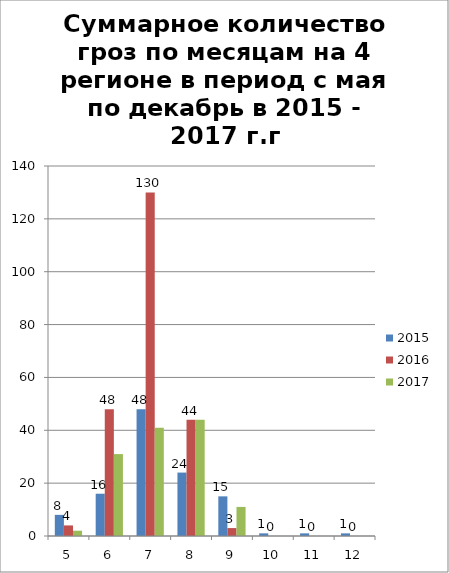
| Category | 2015 | 2016 | 2017 |
|---|---|---|---|
| 5.0 | 8 | 4 | 2 |
| 6.0 | 16 | 48 | 31 |
| 7.0 | 48 | 130 | 41 |
| 8.0 | 24 | 44 | 44 |
| 9.0 | 15 | 3 | 11 |
| 10.0 | 1 | 0 | 0 |
| 11.0 | 1 | 0 | 0 |
| 12.0 | 1 | 0 | 0 |